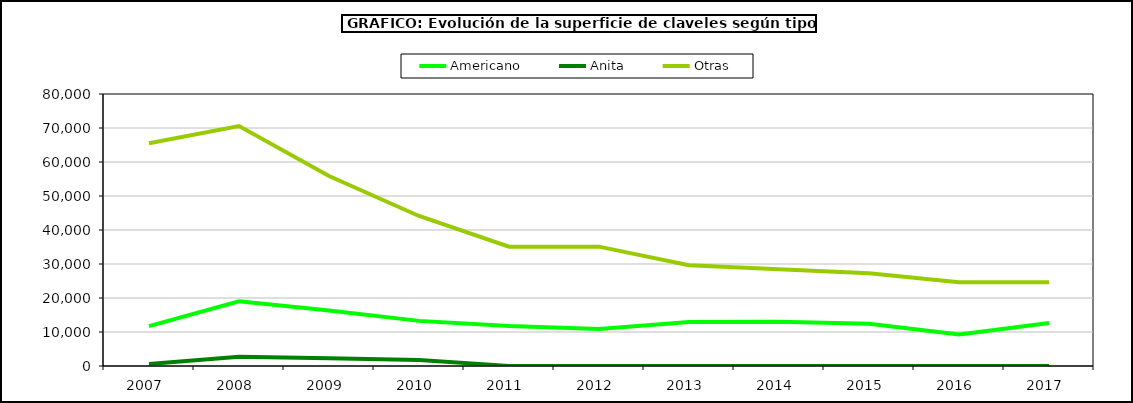
| Category | Americano | Anita | Otras |
|---|---|---|---|
| 2007.0 | 11725 | 600 | 65511 |
| 2008.0 | 19035 | 2700 | 70575 |
| 2009.0 | 16320 | 2300 | 55861 |
| 2010.0 | 13273 | 1800 | 44126 |
| 2011.0 | 11730 | 30 | 35100 |
| 2012.0 | 10894 | 0 | 35100 |
| 2013.0 | 12913 | 0 | 29659 |
| 2014.0 | 13022 | 0 | 28479 |
| 2015.0 | 12405 | 0 | 27308 |
| 2016.0 | 9252 | 0 | 24628 |
| 2017.0 | 12655 | 0 | 24631 |